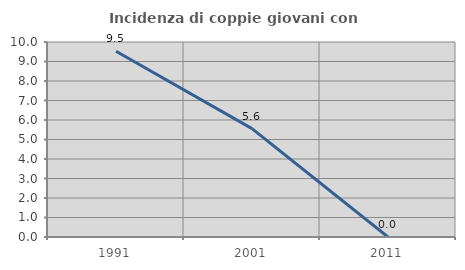
| Category | Incidenza di coppie giovani con figli |
|---|---|
| 1991.0 | 9.524 |
| 2001.0 | 5.556 |
| 2011.0 | 0 |